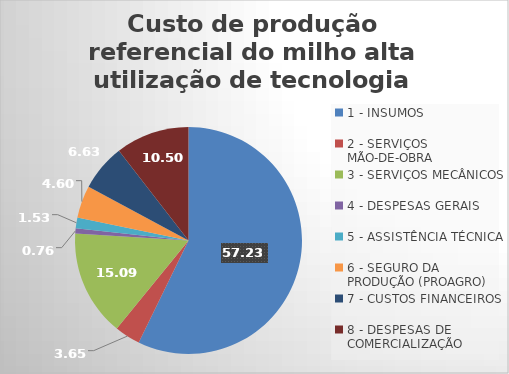
| Category | Series 1 |
|---|---|
| 1 - INSUMOS | 57.231 |
| 2 - SERVIÇOS MÃO-DE-OBRA | 3.653 |
| 3 - SERVIÇOS MECÂNICOS | 15.087 |
| 4 - DESPESAS GERAIS  | 0.76 |
| 5 - ASSISTÊNCIA TÉCNICA | 1.535 |
| 6 - SEGURO DA PRODUÇÃO (PROAGRO) | 4.604 |
| 7 - CUSTOS FINANCEIROS | 6.63 |
| 8 - DESPESAS DE COMERCIALIZAÇÃO | 10.501 |